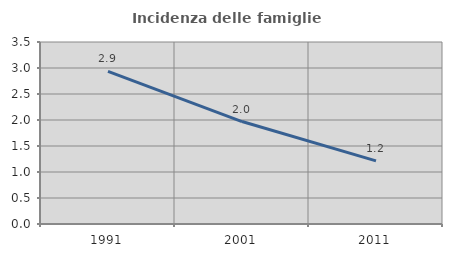
| Category | Incidenza delle famiglie numerose |
|---|---|
| 1991.0 | 2.937 |
| 2001.0 | 1.97 |
| 2011.0 | 1.213 |